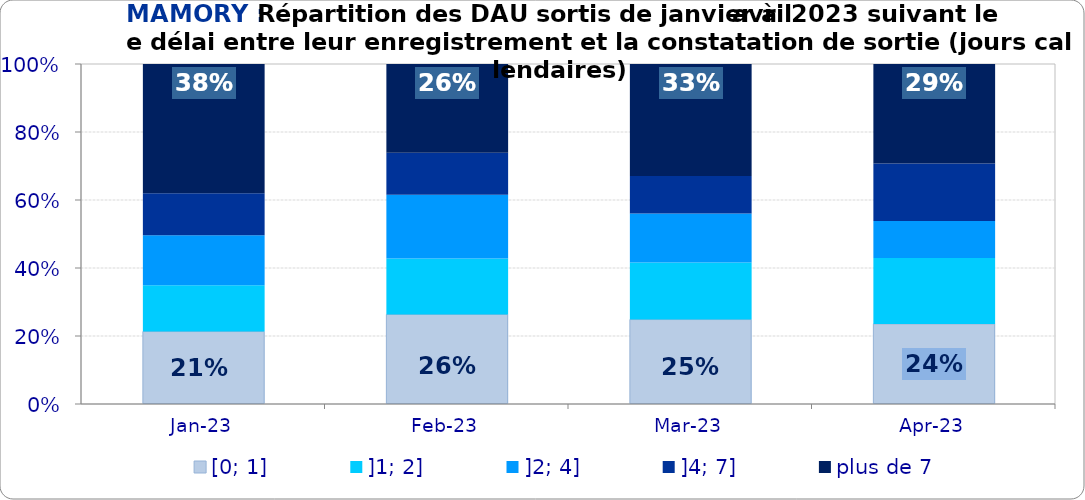
| Category | [0; 1] | ]1; 2] | ]2; 4] | ]4; 7] | plus de 7 |
|---|---|---|---|---|---|
| 2023-01-01 | 0.213 | 0.136 | 0.148 | 0.123 | 0.38 |
| 2023-02-01 | 0.263 | 0.165 | 0.187 | 0.123 | 0.261 |
| 2023-03-01 | 0.248 | 0.168 | 0.145 | 0.11 | 0.329 |
| 2023-04-01 | 0.235 | 0.194 | 0.109 | 0.169 | 0.293 |